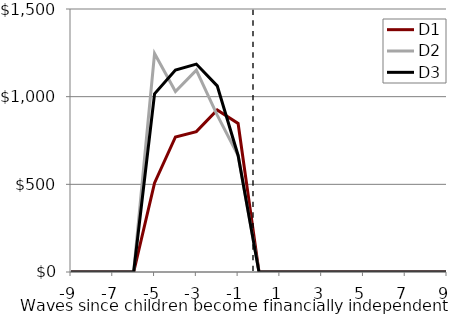
| Category | D1 | D2 | D3 |
|---|---|---|---|
| -9.0 | 0 | 0 | 0 |
| -8.0 | 0 | 0 | 0 |
| -7.0 | 0 | 0 | 0 |
| -6.0 | 0 | 0 | 0 |
| -5.0 | 508.228 | 1245.62 | 1016.456 |
| -4.0 | 770.229 | 1029.002 | 1151.571 |
| -3.0 | 800.469 | 1151.571 | 1185.865 |
| -2.0 | 924.275 | 894.785 | 1061.766 |
| -1.0 | 847.047 | 664.716 | 664.716 |
| 0.0 | 0 | 0 | 0 |
| 1.0 | 0 | 0 | 0 |
| 2.0 | 0 | 0 | 0 |
| 3.0 | 0 | 0 | 0 |
| 4.0 | 0 | 0 | 0 |
| 5.0 | 0 | 0 | 0 |
| 6.0 | 0 | 0 | 0 |
| 7.0 | 0 | 0 | 0 |
| 8.0 | 0 | 0 | 0 |
| 9.0 | 0 | 0 | 0 |